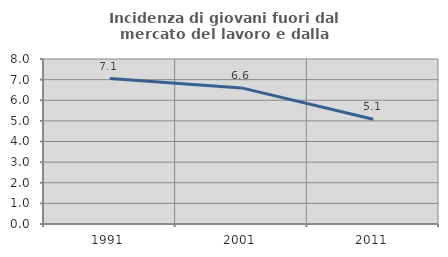
| Category | Incidenza di giovani fuori dal mercato del lavoro e dalla formazione  |
|---|---|
| 1991.0 | 7.05 |
| 2001.0 | 6.599 |
| 2011.0 | 5.079 |